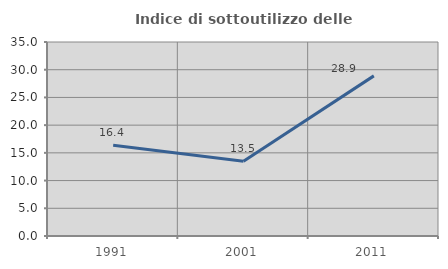
| Category | Indice di sottoutilizzo delle abitazioni  |
|---|---|
| 1991.0 | 16.387 |
| 2001.0 | 13.502 |
| 2011.0 | 28.889 |